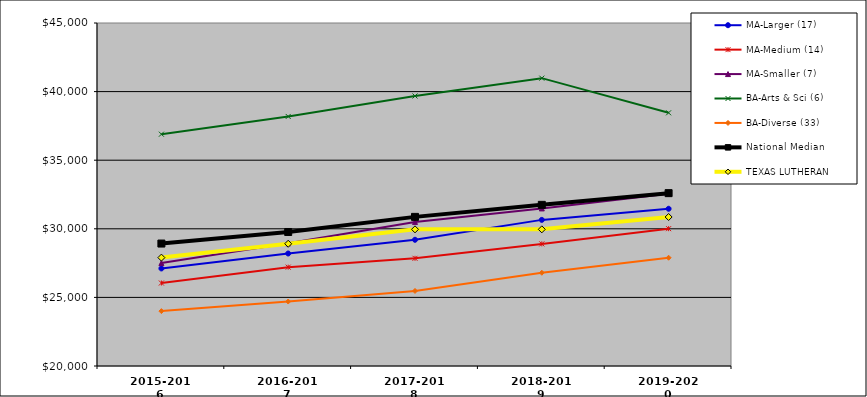
| Category | MA-Larger (17) | MA-Medium (14) | MA-Smaller (7) | BA-Arts & Sci (6) | BA-Diverse (33) | National Median | TEXAS LUTHERAN |
|---|---|---|---|---|---|---|---|
| 2015-2016 | 27110 | 26048 | 27503 | 36895 | 24000 | 28924.5 | 27900 |
| 2016-2017 | 28200 | 27205 | 28943 | 38187.5 | 24700 | 29767 | 28910 |
| 2017-2018 | 29200 | 27850 | 30501 | 39680 | 25470 | 30869 | 29960 |
| 2018-2019 | 30650 | 28900 | 31485 | 40980 | 26796 | 31745 | 29960 |
| 2019-2020 | 31460 | 30010 | 32553 | 38455 | 27890 | 32598 | 30860 |